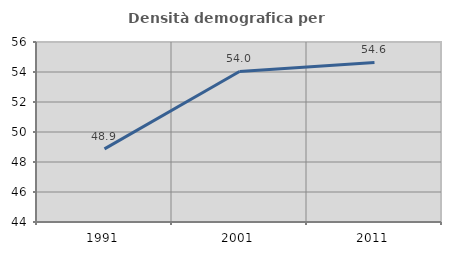
| Category | Densità demografica |
|---|---|
| 1991.0 | 48.873 |
| 2001.0 | 54.035 |
| 2011.0 | 54.638 |